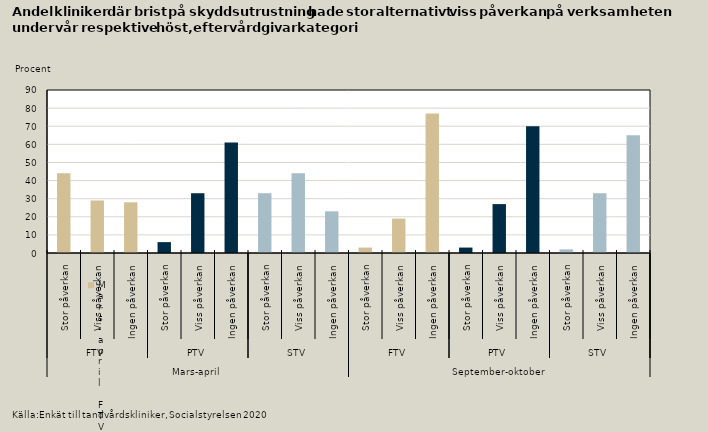
| Category | Brist på skyddsutrustning |
|---|---|
| 0 | 44 |
| 1 | 29 |
| 2 | 28 |
| 3 | 6 |
| 4 | 33 |
| 5 | 61 |
| 6 | 33 |
| 7 | 44 |
| 8 | 23 |
| 9 | 3 |
| 10 | 19 |
| 11 | 77 |
| 12 | 3 |
| 13 | 27 |
| 14 | 70 |
| 15 | 2 |
| 16 | 33 |
| 17 | 65 |